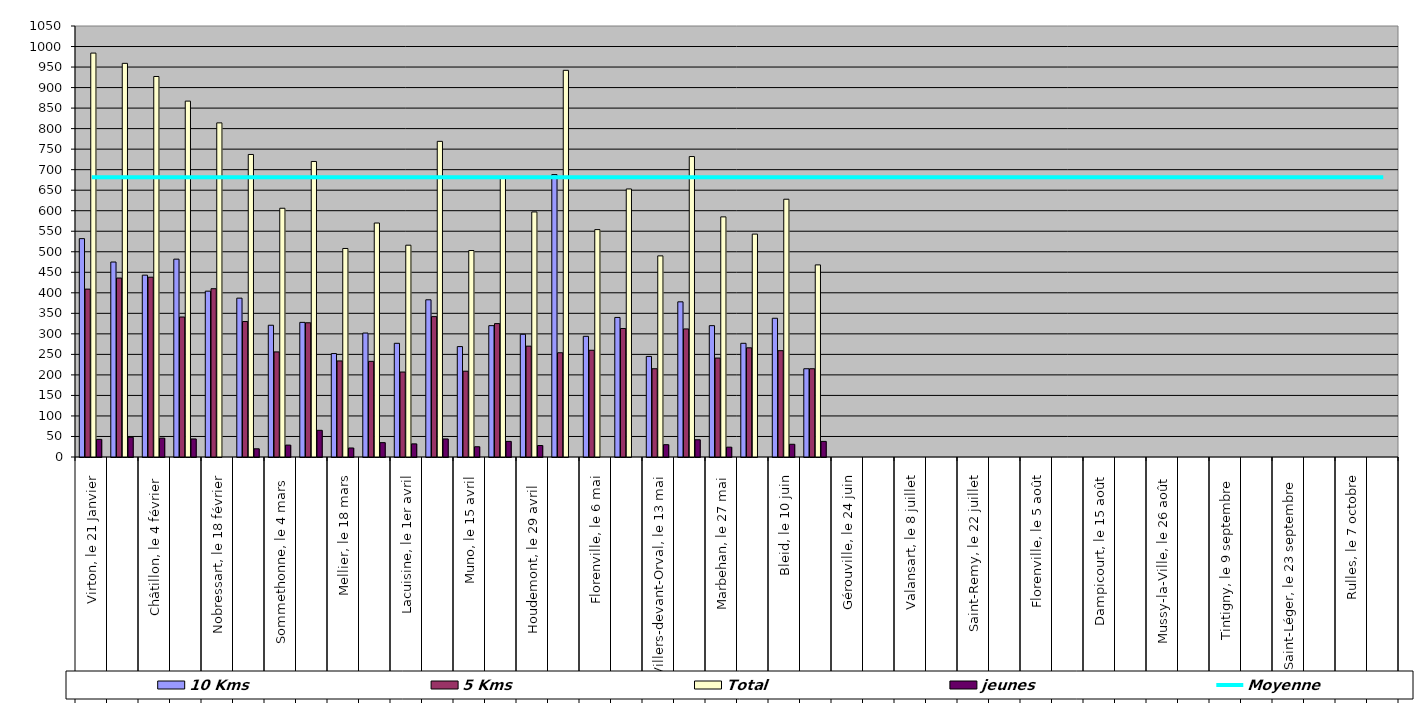
| Category | 10 Kms | 5 Kms | Total | jeunes |
|---|---|---|---|---|
| 0 | 532 | 409 | 984 | 43 |
| 1 | 475 | 436 | 959 | 48 |
| 2 | 443 | 438 | 927 | 46 |
| 3 | 482 | 341 | 867 | 44 |
| 4 | 404 | 410 | 814 | 0 |
| 5 | 387 | 330 | 737 | 20 |
| 6 | 321 | 256 | 606 | 29 |
| 7 | 328 | 327 | 720 | 65 |
| 8 | 252 | 234 | 508 | 22 |
| 9 | 302 | 233 | 570 | 35 |
| 10 | 277 | 207 | 516 | 32 |
| 11 | 383 | 342 | 769 | 44 |
| 12 | 269 | 209 | 503 | 25 |
| 13 | 320 | 325 | 683 | 38 |
| 14 | 299 | 270 | 597 | 28 |
| 15 | 688 | 254 | 942 | 0 |
| 16 | 294 | 260 | 554 | 0 |
| 17 | 340 | 313 | 653 | 0 |
| 18 | 245 | 215 | 490 | 30 |
| 19 | 378 | 312 | 732 | 42 |
| 20 | 320 | 241 | 585 | 24 |
| 21 | 277 | 266 | 543 | 0 |
| 22 | 338 | 259 | 628 | 31 |
| 23 | 215 | 215 | 468 | 38 |
| 24 | 0 | 0 | 0 | 0 |
| 25 | 0 | 0 | 0 | 0 |
| 26 | 0 | 0 | 0 | 0 |
| 27 | 0 | 0 | 0 | 0 |
| 28 | 0 | 0 | 0 | 0 |
| 29 | 0 | 0 | 0 | 0 |
| 30 | 0 | 0 | 0 | 0 |
| 31 | 0 | 0 | 0 | 0 |
| 32 | 0 | 0 | 0 | 0 |
| 33 | 0 | 0 | 0 | 0 |
| 34 | 0 | 0 | 0 | 0 |
| 35 | 0 | 0 | 0 | 0 |
| 36 | 0 | 0 | 0 | 0 |
| 37 | 0 | 0 | 0 | 0 |
| 38 | 0 | 0 | 0 | 0 |
| 39 | 0 | 0 | 0 | 0 |
| 40 | 0 | 0 | 0 | 0 |
| 41 | 0 | 0 | 0 | 0 |